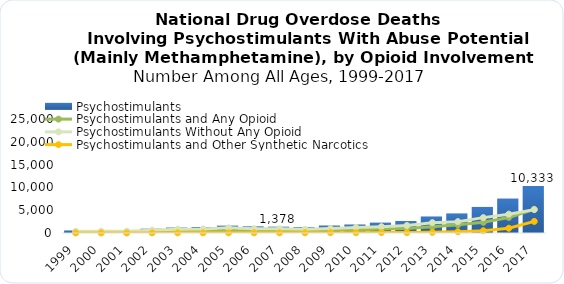
| Category | Psychostimulants |
|---|---|
| 1999.0 | 547 |
| 2000.0 | 578 |
| 2001.0 | 563 |
| 2002.0 | 941 |
| 2003.0 | 1179 |
| 2004.0 | 1305 |
| 2005.0 | 1608 |
| 2006.0 | 1462 |
| 2007.0 | 1378 |
| 2008.0 | 1302 |
| 2009.0 | 1632 |
| 2010.0 | 1854 |
| 2011.0 | 2266 |
| 2012.0 | 2635 |
| 2013.0 | 3627 |
| 2014.0 | 4298 |
| 2015.0 | 5716 |
| 2016.0 | 7542 |
| 2017.0 | 10333 |